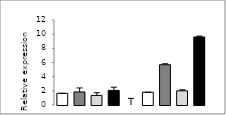
| Category | Series 0 |
|---|---|
|  - | 1.65 |
| HC | 1.842 |